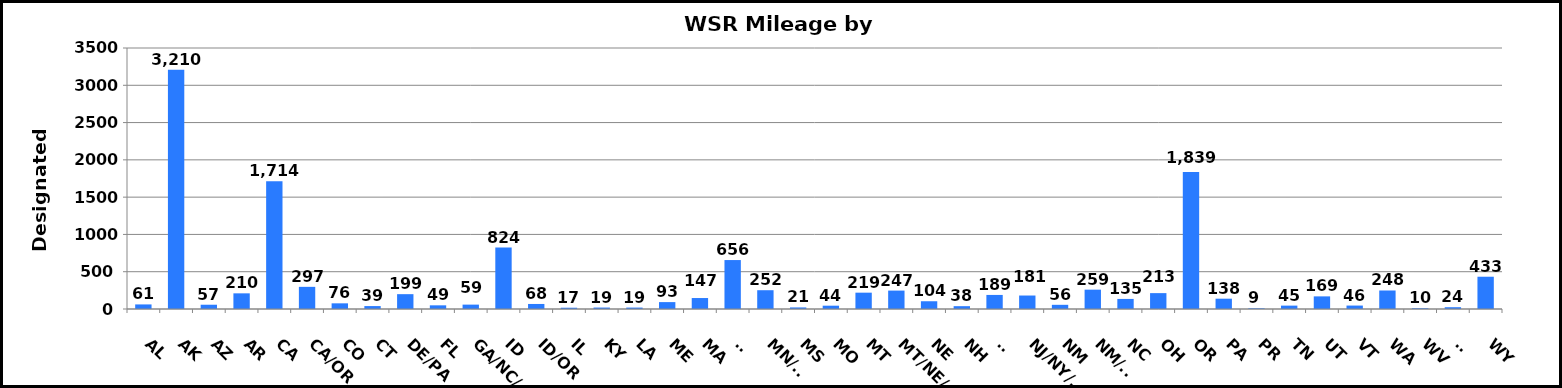
| Category | Miles |
|---|---|
| AL | 61.4 |
| AK | 3210 |
| AZ | 57.3 |
| AR | 210 |
| CA | 1713.6 |
| CA/OR | 297 |
| CO | 76 |
| CT | 39.3 |
| DE/PA | 199 |
| FL | 49.2 |
| GA/NC/SC | 58.7 |
| ID | 823.5 |
| ID/OR | 67.5 |
| IL | 17.1 |
| KY | 19.4 |
| LA | 19 |
| ME | 92.5 |
| MA | 147.1 |
| MI | 656.4 |
| MN/WI | 252 |
| MS | 21 |
| MO | 44.4 |
| MT | 219 |
| MT/NE/SD | 247 |
| NE | 104 |
| NH | 38 |
| NJ | 188.6 |
| NJ/NY/PA | 180.7 |
| NM | 56.1 |
| NM/TX | 259.4 |
| NC | 135 |
| OH | 212.9 |
| OR | 1838.6 |
| PA | 138.3 |
| PR | 8.9 |
| TN | 45.3 |
| UT | 169.3 |
| VT | 46.1 |
| WA | 248.2 |
| WV | 10 |
| WI | 24 |
| WY | 432.7 |